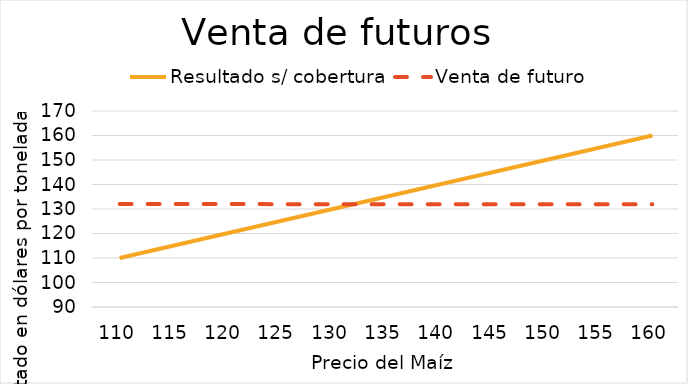
| Category | Resultado s/ cobertura | Venta de futuro |
|---|---|---|
| 110.0 | 110 | 132.023 |
| 115.0 | 115 | 132.01 |
| 120.0 | 120 | 131.998 |
| 125.0 | 125 | 131.986 |
| 130.0 | 130 | 131.973 |
| 135.0 | 135 | 131.96 |
| 140.0 | 140 | 131.948 |
| 145.0 | 145 | 131.936 |
| 150.0 | 150 | 131.923 |
| 155.0 | 155 | 131.91 |
| 160.0 | 160 | 131.898 |